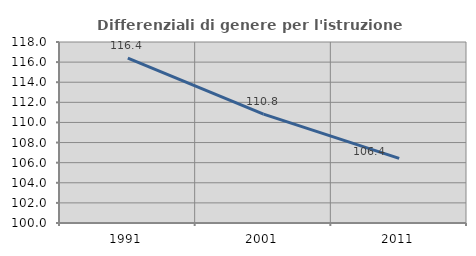
| Category | Differenziali di genere per l'istruzione superiore |
|---|---|
| 1991.0 | 116.401 |
| 2001.0 | 110.825 |
| 2011.0 | 106.423 |